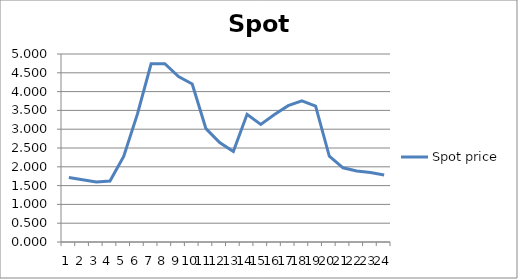
| Category | Spot price |
|---|---|
| 0 | 1.713 |
| 1 | 1.653 |
| 2 | 1.597 |
| 3 | 1.623 |
| 4 | 2.277 |
| 5 | 3.401 |
| 6 | 4.74 |
| 7 | 4.74 |
| 8 | 4.4 |
| 9 | 4.201 |
| 10 | 3.016 |
| 11 | 2.647 |
| 12 | 2.407 |
| 13 | 3.396 |
| 14 | 3.127 |
| 15 | 3.391 |
| 16 | 3.627 |
| 17 | 3.752 |
| 18 | 3.616 |
| 19 | 2.28 |
| 20 | 1.974 |
| 21 | 1.891 |
| 22 | 1.847 |
| 23 | 1.784 |